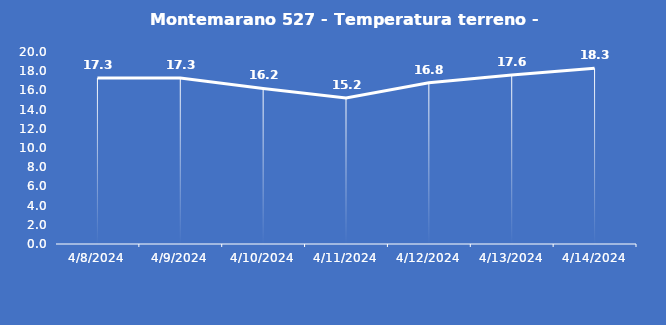
| Category | Montemarano 527 - Temperatura terreno - Grezzo (°C) |
|---|---|
| 4/8/24 | 17.3 |
| 4/9/24 | 17.3 |
| 4/10/24 | 16.2 |
| 4/11/24 | 15.2 |
| 4/12/24 | 16.8 |
| 4/13/24 | 17.6 |
| 4/14/24 | 18.3 |